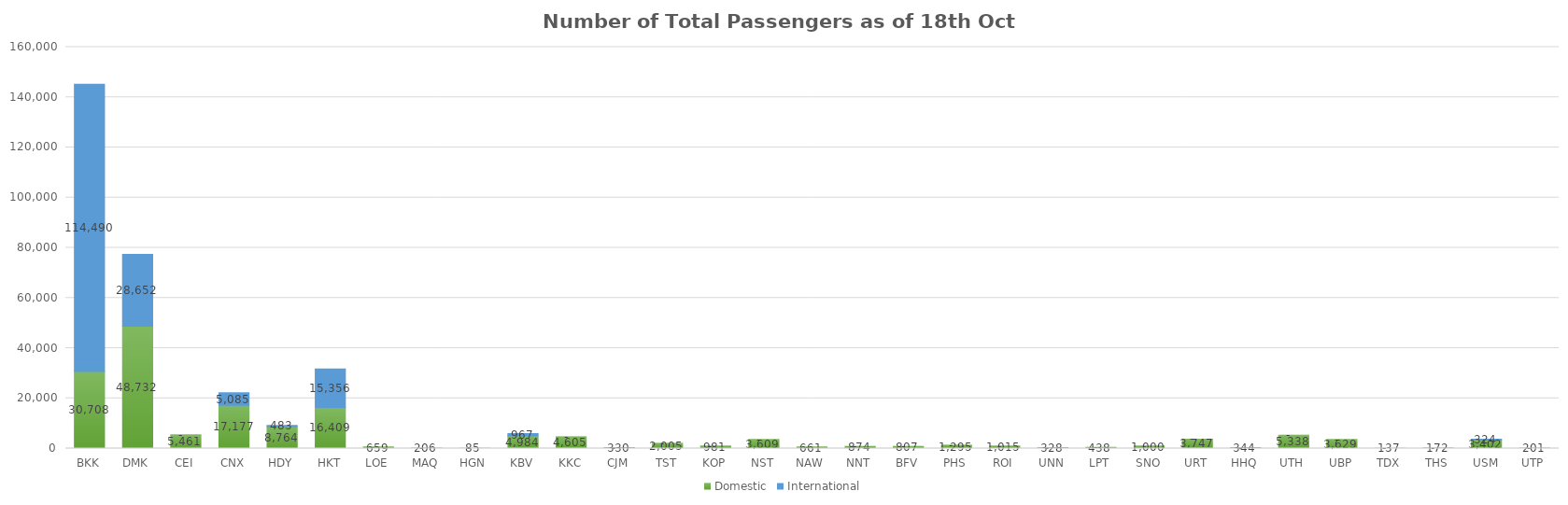
| Category | Domestic | International |
|---|---|---|
| BKK | 30708 | 114490 |
| DMK | 48732 | 28652 |
| CEI | 5461 | 0 |
| CNX | 17177 | 5085 |
| HDY | 8764 | 483 |
| HKT | 16409 | 15356 |
| LOE | 659 | 0 |
| MAQ | 206 | 0 |
| HGN | 85 | 0 |
| KBV | 4984 | 967 |
| KKC | 4605 | 0 |
| CJM | 330 | 0 |
| TST | 2005 | 0 |
| KOP | 981 | 0 |
| NST | 3609 | 0 |
| NAW | 661 | 0 |
| NNT | 874 | 0 |
| BFV | 807 | 0 |
| PHS | 1295 | 0 |
| ROI | 1015 | 0 |
| UNN | 328 | 0 |
| LPT | 438 | 0 |
| SNO | 1000 | 0 |
| URT | 3747 | 0 |
| HHQ | 344 | 0 |
| UTH | 5338 | 0 |
| UBP | 3629 | 0 |
| TDX | 137 | 0 |
| THS | 172 | 0 |
| USM | 3402 | 324 |
| UTP | 201 | 0 |